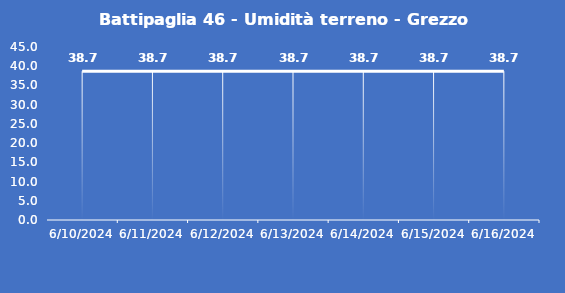
| Category | Battipaglia 46 - Umidità terreno - Grezzo (%VWC) |
|---|---|
| 6/10/24 | 38.7 |
| 6/11/24 | 38.7 |
| 6/12/24 | 38.7 |
| 6/13/24 | 38.7 |
| 6/14/24 | 38.7 |
| 6/15/24 | 38.7 |
| 6/16/24 | 38.7 |